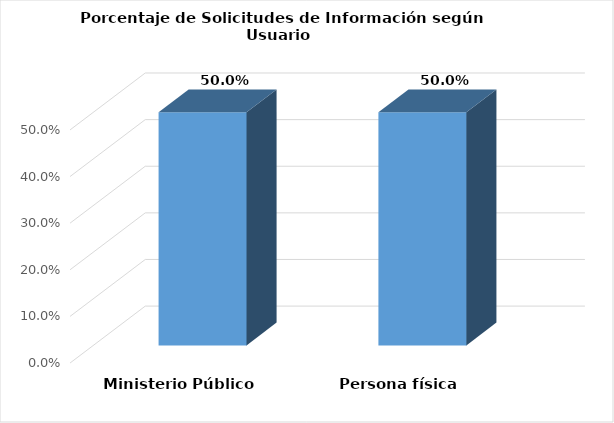
| Category | Series 0 |
|---|---|
| Ministerio Público | 0.5 |
| Persona física | 0.5 |